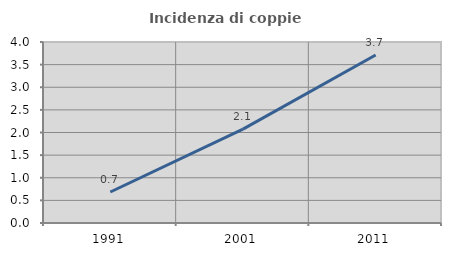
| Category | Incidenza di coppie miste |
|---|---|
| 1991.0 | 0.685 |
| 2001.0 | 2.074 |
| 2011.0 | 3.714 |